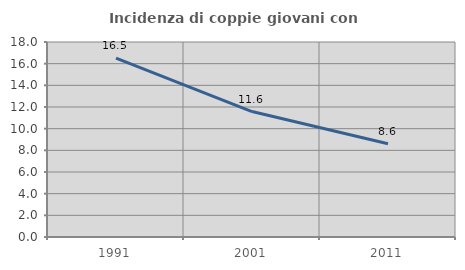
| Category | Incidenza di coppie giovani con figli |
|---|---|
| 1991.0 | 16.514 |
| 2001.0 | 11.579 |
| 2011.0 | 8.602 |